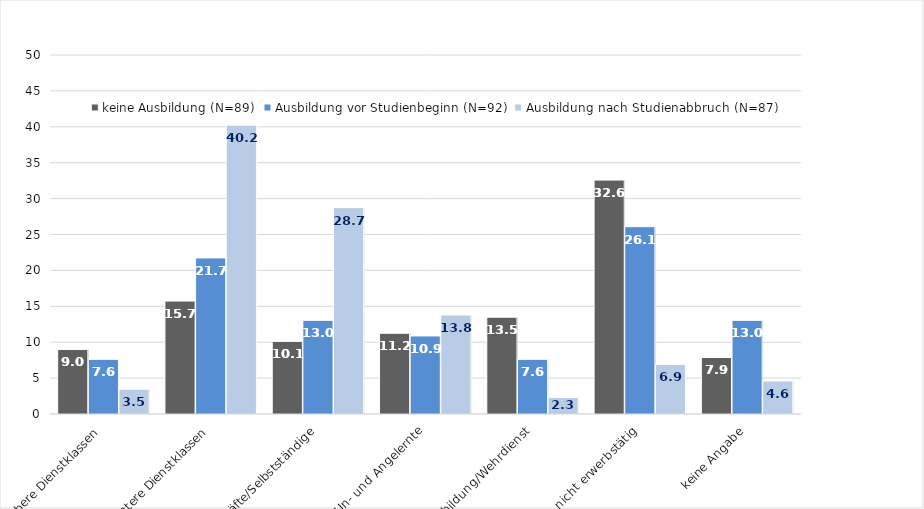
| Category | keine Ausbildung (N=89) | Ausbildung vor Studienbeginn (N=92) | Ausbildung nach Studienabbruch (N=87) |
|---|---|---|---|
| obere Dienstklassen | 8.99 | 7.61 | 3.45 |
| untere Dienstklassen | 15.73 | 21.74 | 40.23 |
| Fachkräfte/Selbstständige | 10.11 | 13.04 | 28.74 |
| Un- und Angelernte | 11.24 | 10.87 | 13.79 |
| Ausbildung/Wehrdienst | 13.48 | 7.61 | 2.3 |
| nicht erwerbstätig | 32.58 | 26.09 | 6.9 |
| keine Angabe | 7.87 | 13.04 | 4.6 |